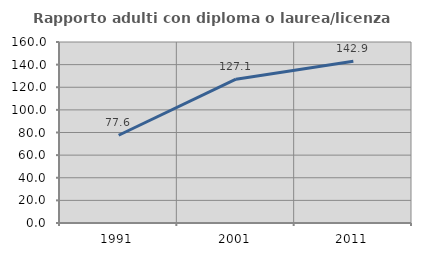
| Category | Rapporto adulti con diploma o laurea/licenza media  |
|---|---|
| 1991.0 | 77.57 |
| 2001.0 | 127.096 |
| 2011.0 | 142.949 |